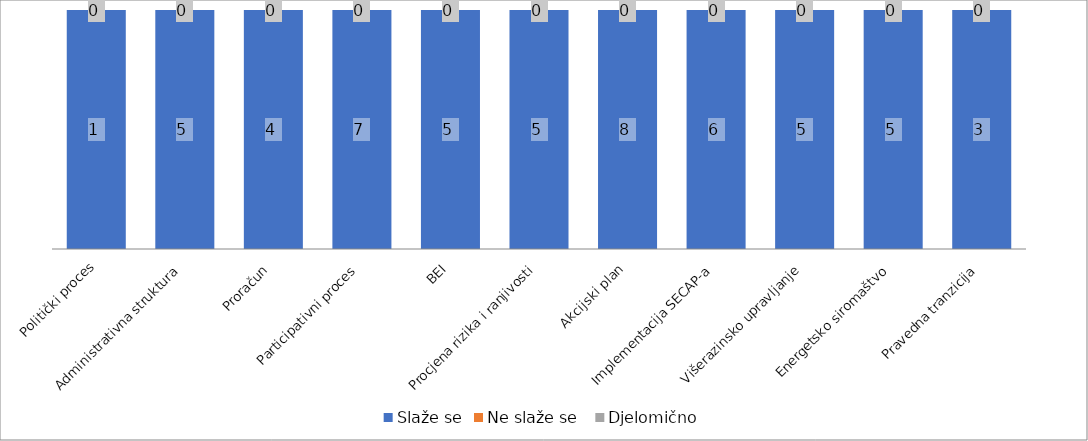
| Category | Slaže se | Ne slaže se  | Djelomično |
|---|---|---|---|
| Politički proces | 1 | 0 | 0 |
| Administrativna struktura | 5 | 0 | 0 |
| Proračun | 4 | 0 | 0 |
| Participativni proces | 7 | 0 | 0 |
| BEI | 5 | 0 | 0 |
| Procjena rizika i ranjivosti | 5 | 0 | 0 |
| Akcijski plan | 8 | 0 | 0 |
| Implementacija SECAP-a | 6 | 0 | 0 |
| Višerazinsko upravljanje | 5 | 0 | 0 |
| Energetsko siromaštvo | 5 | 0 | 0 |
| Pravedna tranzicija | 3 | 0 | 0 |